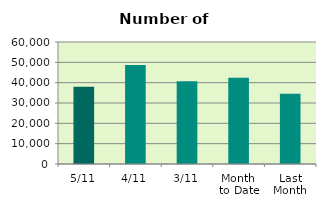
| Category | Series 0 |
|---|---|
| 5/11 | 38022 |
| 4/11 | 48684 |
| 3/11 | 40698 |
| Month 
to Date | 42426 |
| Last
Month | 34490.636 |